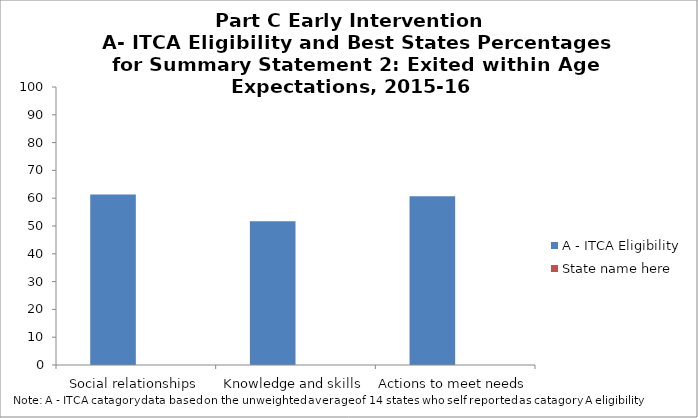
| Category | A - ITCA Eligibility | State name here |
|---|---|---|
| Social relationships | 61.3 |  |
| Knowledge and skills | 51.7 |  |
| Actions to meet needs | 60.7 |  |